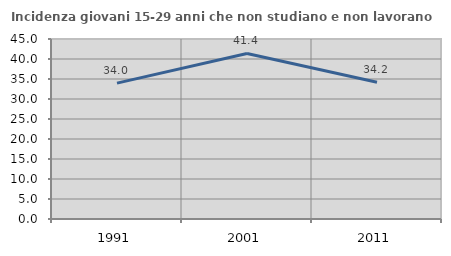
| Category | Incidenza giovani 15-29 anni che non studiano e non lavorano  |
|---|---|
| 1991.0 | 33.962 |
| 2001.0 | 41.379 |
| 2011.0 | 34.191 |